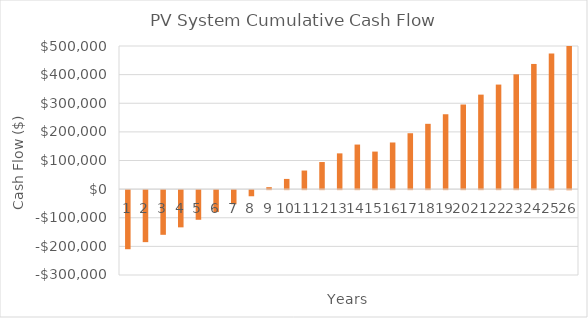
| Category | 1 |
|---|---|
| 0 | -206460 |
| 1 | -181710 |
| 2 | -156095.242 |
| 3 | -130050.784 |
| 4 | -103569.431 |
| 5 | -76643.867 |
| 6 | -49266.656 |
| 7 | -21430.236 |
| 8 | 6873.081 |
| 9 | 35651.111 |
| 10 | 64911.801 |
| 11 | 94663.229 |
| 12 | 124913.612 |
| 13 | 155671.299 |
| 14 | 131144.783 |
| 15 | 162942.695 |
| 16 | 195273.813 |
| 17 | 228147.061 |
| 18 | 261571.51 |
| 19 | 295556.386 |
| 20 | 330111.065 |
| 21 | 365245.082 |
| 22 | 400968.131 |
| 23 | 437290.067 |
| 24 | 474220.91 |
| 25 | 511770.848 |